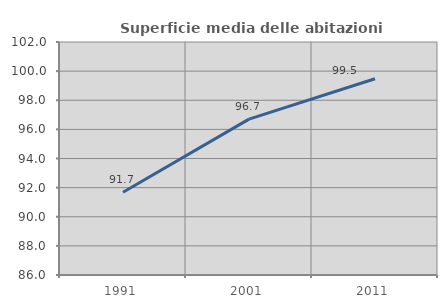
| Category | Superficie media delle abitazioni occupate |
|---|---|
| 1991.0 | 91.682 |
| 2001.0 | 96.704 |
| 2011.0 | 99.477 |